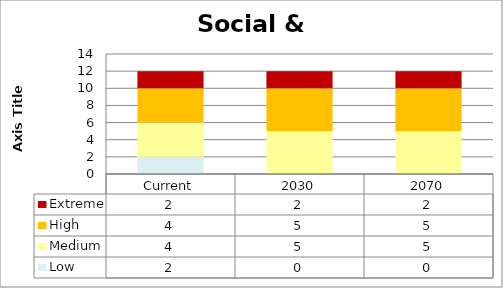
| Category | Low | Medium | High | Extreme |
|---|---|---|---|---|
| Current | 2 | 4 | 4 | 2 |
| 2030 | 0 | 5 | 5 | 2 |
| 2070 | 0 | 5 | 5 | 2 |